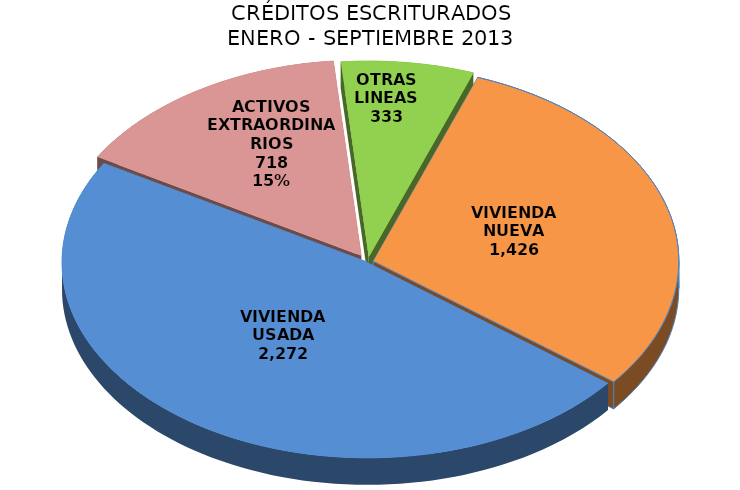
| Category | Series 0 |
|---|---|
| VIVIENDA NUEVA | 1426 |
| VIVIENDA USADA | 2272 |
| ACTIVOS EXTRAORDINARIOS | 718 |
| OTRAS LINEAS | 333 |